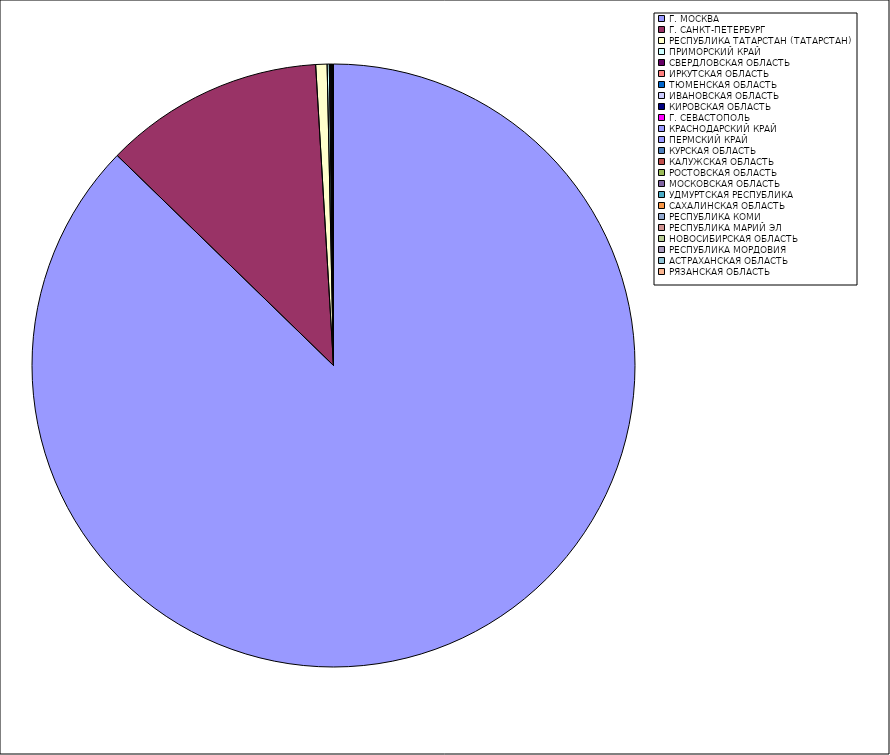
| Category | Оборот |
|---|---|
| Г. МОСКВА | 87.261 |
| Г. САНКТ-ПЕТЕРБУРГ | 11.79 |
| РЕСПУБЛИКА ТАТАРСТАН (ТАТАРСТАН) | 0.607 |
| ПРИМОРСКИЙ КРАЙ | 0.117 |
| СВЕРДЛОВСКАЯ ОБЛАСТЬ | 0.066 |
| ИРКУТСКАЯ ОБЛАСТЬ | 0.056 |
| ТЮМЕНСКАЯ ОБЛАСТЬ | 0.025 |
| ИВАНОВСКАЯ ОБЛАСТЬ | 0.012 |
| КИРОВСКАЯ ОБЛАСТЬ | 0.01 |
| Г. СЕВАСТОПОЛЬ | 0.009 |
| КРАСНОДАРСКИЙ КРАЙ | 0.008 |
| ПЕРМСКИЙ КРАЙ | 0.006 |
| КУРСКАЯ ОБЛАСТЬ | 0.006 |
| КАЛУЖСКАЯ ОБЛАСТЬ | 0.004 |
| РОСТОВСКАЯ ОБЛАСТЬ | 0.003 |
| МОСКОВСКАЯ ОБЛАСТЬ | 0.003 |
| УДМУРТСКАЯ РЕСПУБЛИКА | 0.003 |
| САХАЛИНСКАЯ ОБЛАСТЬ | 0.003 |
| РЕСПУБЛИКА КОМИ | 0.002 |
| РЕСПУБЛИКА МАРИЙ ЭЛ | 0.002 |
| НОВОСИБИРСКАЯ ОБЛАСТЬ | 0.002 |
| РЕСПУБЛИКА МОРДОВИЯ | 0.001 |
| АСТРАХАНСКАЯ ОБЛАСТЬ | 0.001 |
| РЯЗАНСКАЯ ОБЛАСТЬ | 0.001 |